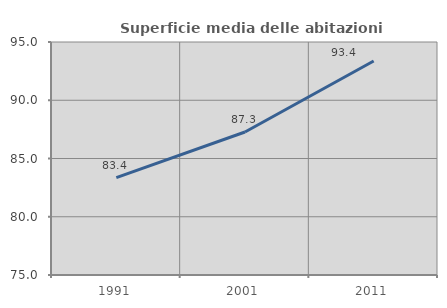
| Category | Superficie media delle abitazioni occupate |
|---|---|
| 1991.0 | 83.365 |
| 2001.0 | 87.273 |
| 2011.0 | 93.373 |